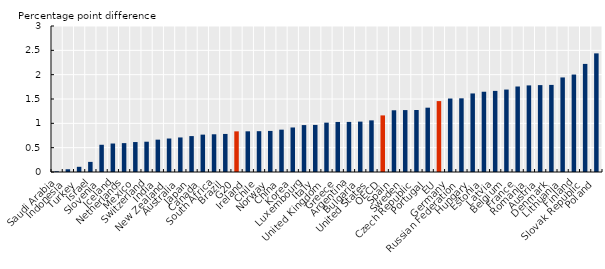
| Category | Percentage point difference in government primary revenue as percentage of GDP |
|---|---|
| Saudi Arabia | 0.016 |
| Indonesia | 0.057 |
| Turkey | 0.107 |
| Israel | 0.208 |
| Slovenia | 0.559 |
| Iceland | 0.585 |
| Netherlands | 0.594 |
| Mexico | 0.616 |
| Switzerland | 0.622 |
| India | 0.664 |
| New Zealand | 0.688 |
| Australia | 0.71 |
| Japan | 0.738 |
| Canada | 0.768 |
| South Africa | 0.775 |
| Brazil | 0.782 |
| G20 | 0.835 |
| Ireland | 0.836 |
| Chile | 0.839 |
| Norway | 0.844 |
| China | 0.87 |
| Korea | 0.915 |
| Luxembourg | 0.964 |
| Italy | 0.967 |
| United Kingdom | 1.014 |
| Greece | 1.028 |
| Argentina | 1.029 |
| Bulgaria | 1.035 |
| United States | 1.061 |
| OECD | 1.163 |
| Spain | 1.268 |
| Sweden | 1.272 |
| Czech Republic | 1.274 |
| Portugal | 1.322 |
| EU | 1.457 |
| Germany | 1.51 |
| Russian Federation | 1.514 |
| Hungary | 1.614 |
| Estonia | 1.649 |
| Latvia | 1.667 |
| Belgium | 1.694 |
| France | 1.757 |
| Romania | 1.78 |
| Austria | 1.785 |
| Denmark | 1.79 |
| Lithuania | 1.943 |
| Finland | 2.003 |
| Slovak Republic | 2.221 |
| Poland | 2.438 |